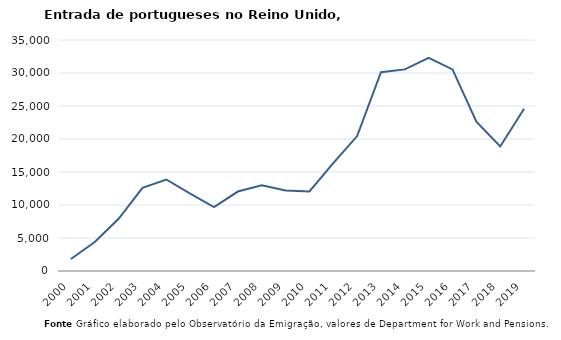
| Category | Entradas |
|---|---|
| 2000.0 | 1811 |
| 2001.0 | 4396 |
| 2002.0 | 7915 |
| 2003.0 | 12603 |
| 2004.0 | 13867 |
| 2005.0 | 11712 |
| 2006.0 | 9696 |
| 2007.0 | 12039 |
| 2008.0 | 12983 |
| 2009.0 | 12211 |
| 2010.0 | 12064 |
| 2011.0 | 16347 |
| 2012.0 | 20443 |
| 2013.0 | 30121 |
| 2014.0 | 30546 |
| 2015.0 | 32301 |
| 2016.0 | 30543 |
| 2017.0 | 22622 |
| 2018.0 | 18871 |
| 2019.0 | 24593 |